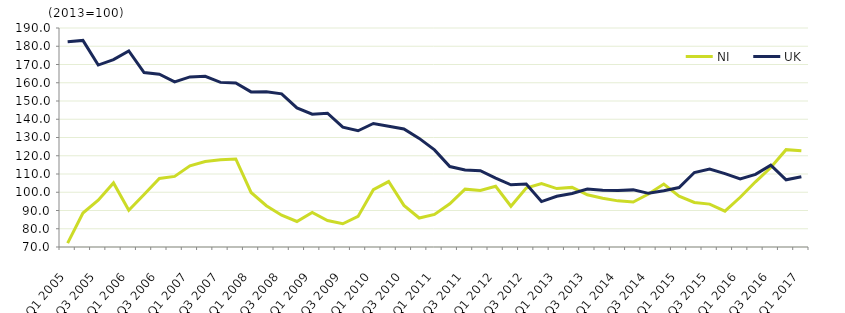
| Category | NI  | UK  |
|---|---|---|
| Q1 2005 | 72.12 | 182.5 |
| Q2 2005 | 88.611 | 183.2 |
| Q3 2005 | 95.682 | 169.7 |
| Q4 2005 | 105.108 | 172.7 |
| Q1 2006 | 90.107 | 177.4 |
| Q2 2006 | 98.758 | 165.6 |
| Q3 2006 | 107.548 | 164.7 |
| Q4 2006 | 108.699 | 160.5 |
| Q1 2007 | 114.512 | 163.2 |
| Q2 2007 | 116.866 | 163.5 |
| Q3 2007 | 117.824 | 160.2 |
| Q4 2007 | 118.225 | 159.9 |
| Q1 2008 | 99.865 | 155 |
| Q2 2008 | 92.618 | 155.1 |
| Q3 2008 | 87.448 | 153.9 |
| Q4 2008 | 83.979 | 146.2 |
| Q1 2009 | 88.944 | 142.8 |
| Q2 2009 | 84.537 | 143.3 |
| Q3 2009 | 82.737 | 135.7 |
| Q4 2009 | 86.754 | 133.7 |
| Q1 2010 | 101.42 | 137.7 |
| Q2 2010 | 105.857 | 136.2 |
| Q3 2010 | 92.81 | 134.7 |
| Q4 2010 | 85.888 | 129.5 |
| Q1 2011 | 87.82 | 123.2 |
| Q2 2011 | 93.698 | 114.1 |
| Q3 2011 | 101.701 | 112.2 |
| Q4 2011 | 100.958 | 111.8 |
| Q1 2012 | 103.29 | 107.8 |
| Q2 2012 | 92.321 | 104.1 |
| Q3 2012 | 102.288 | 104.5 |
| Q4 2012 | 104.811 | 94.9 |
| Q1 2013 | 102 | 97.8 |
| Q2 2013 | 102.664 | 99.3 |
| Q3 2013 | 98.64 | 101.8 |
| Q4 2013 | 96.696 | 101.1 |
| Q1 2014 | 95.283 | 100.9 |
| Q2 2014 | 94.636 | 101.3 |
| Q3 2014 | 99.064 | 99.4 |
| Q4 2014 | 104.478 | 100.8 |
| Q1 2015 | 97.894 | 102.6 |
| Q2 2015 | 94.406 | 110.8 |
| Q3 2015 | 93.499 | 112.7 |
| Q4 2015 | 89.611 | 110.2 |
| Q1 2016 | 97.26 | 107.3 |
| Q2 2016 | 105.721 | 109.8 |
| Q3 2016 | 113.547 | 114.8 |
| Q4 2016 | 123.328 | 106.8 |
| Q1 2017 | 122.701 | 108.5 |